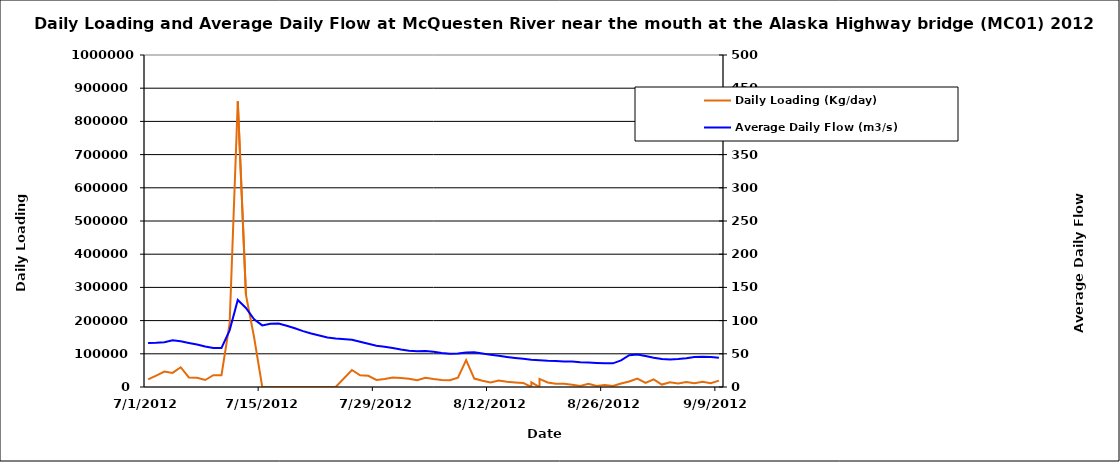
| Category | Daily Loading (Kg/day) |
|---|---|
| 41091.0 | 22844.16 |
| 41092.0 | 34473.6 |
| 41093.0 | 46656 |
| 41094.0 | 42517.44 |
| 41095.0 | 59529.6 |
| 41096.0 | 28684.8 |
| 41097.0 | 27648 |
| 41098.0 | 21081.6 |
| 41099.0 | 35501.76 |
| 41100.0 | 35501.76 |
| 41101.0 | 191842.56 |
| 41102.0 | 860198.4 |
| 41103.0 | 277603.2 |
| 41104.0 | 149817.6 |
| 41105.0 | 0 |
| 41106.0 | 0 |
| 41107.0 | 0 |
| 41108.0 | 0 |
| 41109.0 | 0 |
| 41110.0 | 0 |
| 41111.0 | 0 |
| 41112.0 | 0 |
| 41113.0 | 0 |
| 41114.0 | 0 |
| 41116.0 | 51120 |
| 41117.0 | 35354.88 |
| 41118.0 | 33747.84 |
| 41119.0 | 21461.76 |
| 41120.0 | 24433.92 |
| 41121.0 | 28449.792 |
| 41122.0 | 27288.576 |
| 41123.0 | 25159.68 |
| 41124.0 | 20217.6 |
| 41125.0 | 28045.44 |
| 41126.0 | 23811.84 |
| 41127.0 | 21233.664 |
| 41128.0 | 20694.528 |
| 41129.0 | 27813.888 |
| 41130.0 | 81025.92 |
| 41131.0 | 25353.216 |
| 41132.0 | 18944.64 |
| 41133.0 | 13381.632 |
| 41134.0 | 19491.84 |
| 41135.0 | 15655.68 |
| 41136.0 | 13875.84 |
| 41137.0 | 12211.2 |
| 41138.0 | 0 |
| 41138.0 | 14204.16 |
| 41139.0 | 0 |
| 41139.0 | 24312.96 |
| 41140.0 | 13616.64 |
| 41141.0 | 10108.8 |
| 41142.0 | 9979.2 |
| 41143.0 | 6618.24 |
| 41144.0 | 3231.36 |
| 41145.0 | 9564.48 |
| 41146.0 | 3127.68 |
| 41147.0 | 6151.68 |
| 41148.0 | 3075.84 |
| 41149.0 | 10393.92 |
| 41150.0 | 16519.68 |
| 41151.0 | 25401.6 |
| 41152.0 | 12078.72 |
| 41153.0 | 22809.6 |
| 41154.0 | 7309.44 |
| 41155.0 | 14273.28 |
| 41156.0 | 10886.4 |
| 41157.0 | 14964.48 |
| 41158.0 | 11664 |
| 41159.0 | 15724.8 |
| 41160.0 | 11664 |
| 41161.0 | 19094.4 |